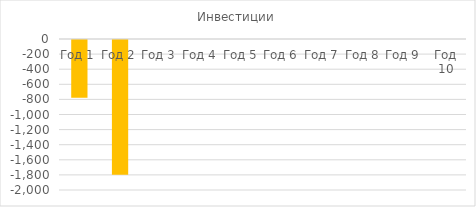
| Category | Инвестиции |
|---|---|
| Год 1 | -765 |
| Год 2 | -1785 |
| Год 3 | 0 |
| Год 4 | 0 |
| Год 5 | 0 |
| Год 6 | 0 |
| Год 7 | 0 |
| Год 8 | 0 |
| Год 9 | 0 |
| Год 10 | 0 |